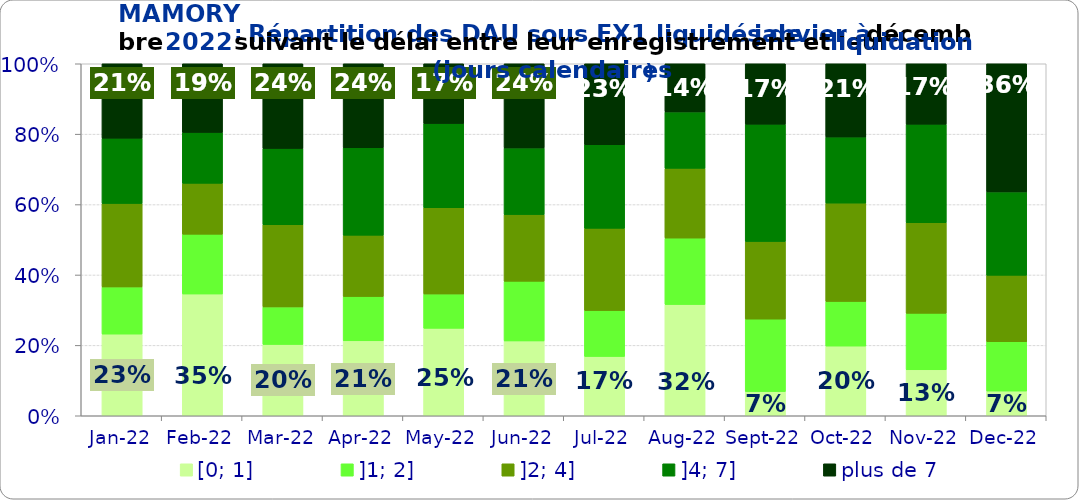
| Category | [0; 1] | ]1; 2] | ]2; 4] | ]4; 7] | plus de 7 |
|---|---|---|---|---|---|
| 2022-01-01 | 0.232 | 0.134 | 0.237 | 0.186 | 0.211 |
| 2022-02-01 | 0.346 | 0.17 | 0.145 | 0.145 | 0.195 |
| 2022-03-01 | 0.203 | 0.107 | 0.234 | 0.216 | 0.241 |
| 2022-04-01 | 0.213 | 0.126 | 0.174 | 0.248 | 0.239 |
| 2022-05-01 | 0.248 | 0.097 | 0.245 | 0.239 | 0.17 |
| 2022-06-01 | 0.213 | 0.169 | 0.189 | 0.189 | 0.239 |
| 2022-07-01 | 0.169 | 0.13 | 0.234 | 0.238 | 0.23 |
| 2022-08-01 | 0.316 | 0.189 | 0.198 | 0.16 | 0.137 |
| 2022-09-01 | 0.069 | 0.206 | 0.221 | 0.333 | 0.172 |
| 2022-10-01 | 0.198 | 0.127 | 0.279 | 0.188 | 0.208 |
| 2022-11-01 | 0.131 | 0.16 | 0.257 | 0.28 | 0.172 |
| 2022-12-01 | 0.07 | 0.14 | 0.189 | 0.237 | 0.364 |